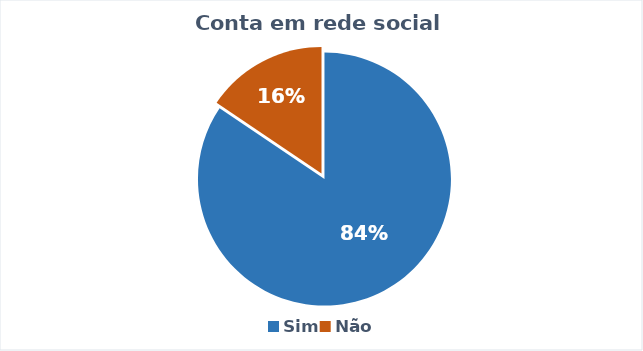
| Category | Series 0 |
|---|---|
| Sim | 38 |
| Não | 7 |